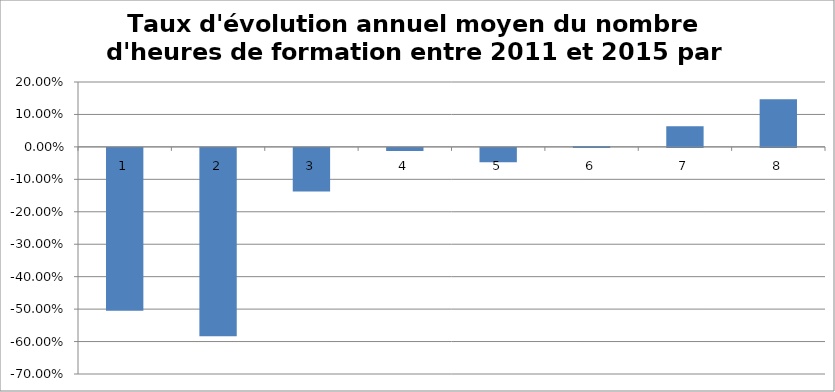
| Category | Taux d'évolution annuel moyen |
|---|---|
| 0 | -0.502 |
| 1 | -0.58 |
| 2 | -0.134 |
| 3 | -0.009 |
| 4 | -0.044 |
| 5 | 0.003 |
| 6 | 0.063 |
| 7 | 0.147 |